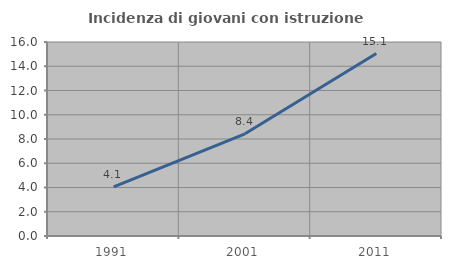
| Category | Incidenza di giovani con istruzione universitaria |
|---|---|
| 1991.0 | 4.06 |
| 2001.0 | 8.427 |
| 2011.0 | 15.051 |